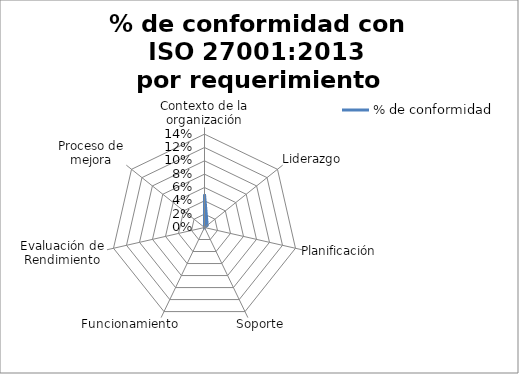
| Category | % de conformidad |
|---|---|
| Contexto de la organización | 0.05 |
| Liderazgo | 0.005 |
| Planificación | 0 |
| Soporte | 0 |
| Funcionamiento | 0 |
| Evaluación de Rendimiento | 0 |
| Proceso de mejora | 0 |